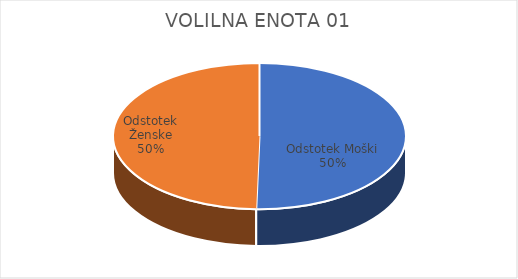
| Category | VOLILNA ENOTA 01 |
|---|---|
| Odstotek Moški | 7.84 |
| Odstotek Ženske | 7.73 |